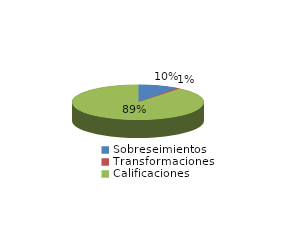
| Category | Series 0 |
|---|---|
| Sobreseimientos | 35 |
| Transformaciones | 3 |
| Calificaciones | 319 |